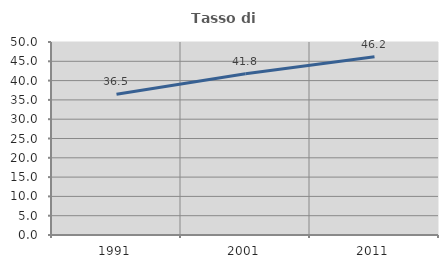
| Category | Tasso di occupazione   |
|---|---|
| 1991.0 | 36.458 |
| 2001.0 | 41.758 |
| 2011.0 | 46.187 |